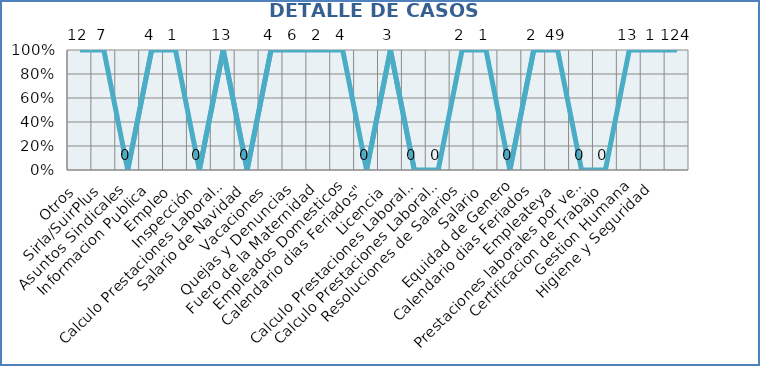
| Category | Series 0 |
|---|---|
| Otros | 12 |
| Sirla/SuirPlus | 7 |
| Asuntos Sindicales | 0 |
| Informacion Publica | 4 |
| Empleo | 1 |
| Inspección | 0 |
| Calculo Prestaciones Laborales | 13 |
| Salario de Navidad | 0 |
| Vacaciones | 4 |
| Quejas y Denuncias | 6 |
| Fuero de la Maternidad | 2 |
| Empleados Domesticos | 4 |
| Calendario dias Feriados" | 0 |
| Licencia | 3 |
| Calculo Prestaciones Laborales por quiebra empresa | 0 |
| Calculo Prestaciones Laborales por renuncia | 0 |
| Resoluciones de Salarios | 2 |
| Salario | 1 |
| Equidad de Genero | 0 |
| Calendario dias Feriados | 2 |
| Empleateya | 49 |
| Prestaciones laborales por venta empresa | 0 |
| Certificacion de Trabajo | 0 |
| Gestion Humana | 13 |
| Higiene y Seguridad | 1 |